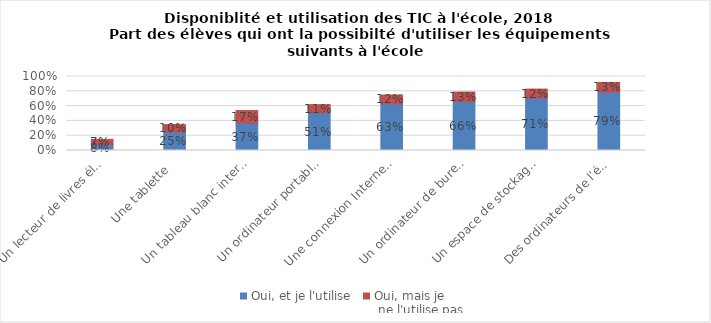
| Category | Oui, et je l'utilise | Oui, mais je
 ne l'utilise pas |
|---|---|---|
| Un lecteur de livres électroniques  | 0.08 | 0.07 |
| Une tablette  | 0.25 | 0.1 |
| Un tableau blanc interactif  | 0.37 | 0.17 |
| Un ordinateur portable   | 0.51 | 0.11 |
| Une connexion Internet WIFI  | 0.63 | 0.12 |
| Un ordinateur de bureau  | 0.66 | 0.13 |
| Un espace de stockage pour des données scolaires  | 0.71 | 0.12 |
| Des ordinateurs de l’école connectés à Internet  | 0.79 | 0.13 |